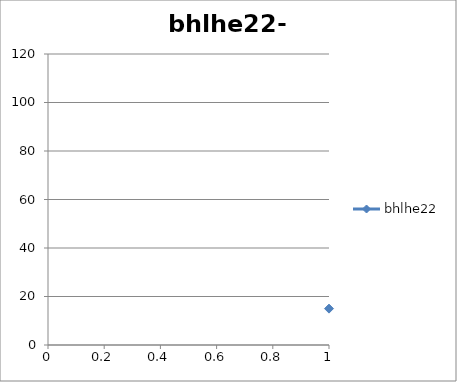
| Category | bhlhe22 |
|---|---|
| 0 | 15 |
| 1 | 14 |
| 2 | 14 |
| 3 | 6 |
| 4 | 9 |
| 5 | 3 |
| 6 | 109 |
| 7 | 0 |
| 8 | 0 |
| 9 | 5 |
| 10 | 0 |